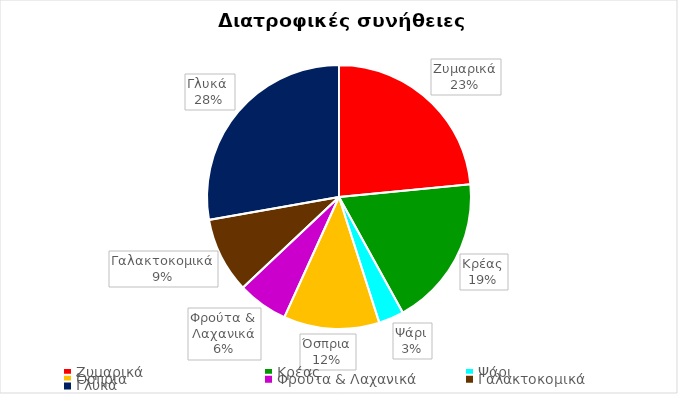
| Category | Αριθμός μαθητών |
|---|---|
| Ζυμαρικά | 38 |
| Κρέας | 30 |
| Ψάρι | 5 |
| Όσπρια | 19 |
| Φρούτα & Λαχανικά | 10 |
| Γαλακτοκομικά | 15 |
| Γλυκά  | 45 |